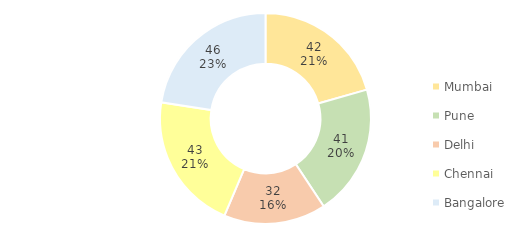
| Category | Series 0 |
|---|---|
| Mumbai | 42 |
| Pune | 41 |
| Delhi | 32 |
| Chennai | 43 |
| Bangalore | 46 |